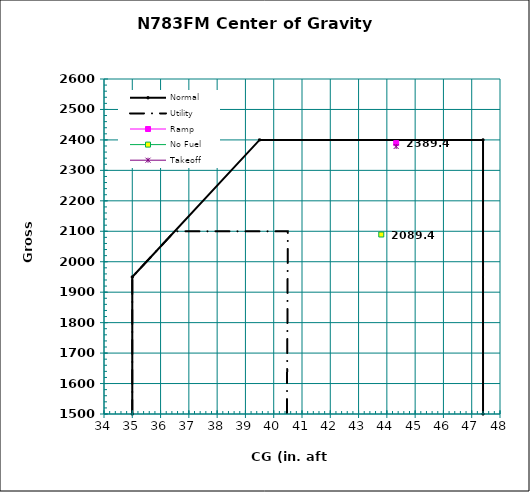
| Category | Normal |
|---|---|
| 35.0 | 1500 |
| 35.0 | 1950 |
| 39.5 | 2400 |
| 47.4 | 2400 |
| 47.4 | 1500 |